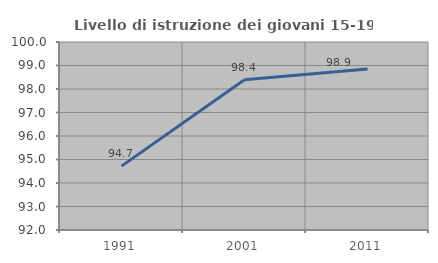
| Category | Livello di istruzione dei giovani 15-19 anni |
|---|---|
| 1991.0 | 94.718 |
| 2001.0 | 98.396 |
| 2011.0 | 98.851 |